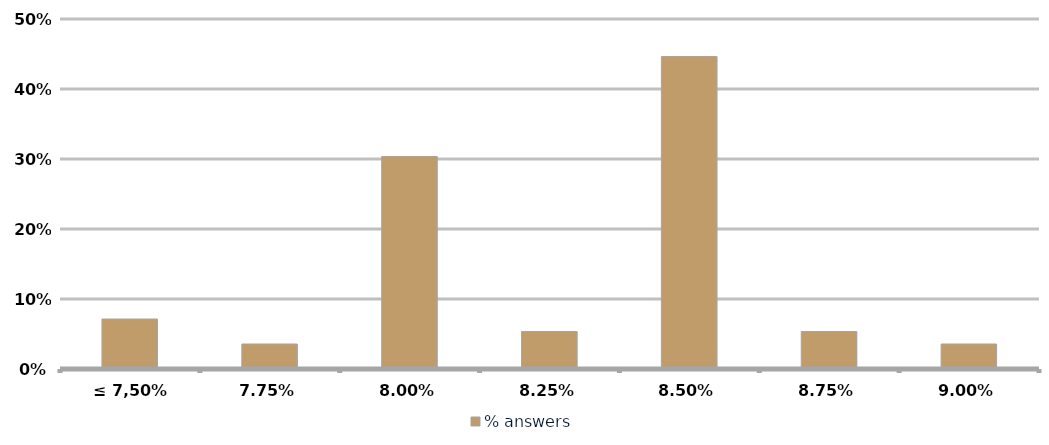
| Category | % answers |
|---|---|
| ≤ 7,50% | 0.071 |
| 7,75% | 0.036 |
| 8,00% | 0.304 |
| 8,25% | 0.054 |
| 8,50% | 0.446 |
| 8,75% | 0.054 |
| 9,00% | 0.036 |